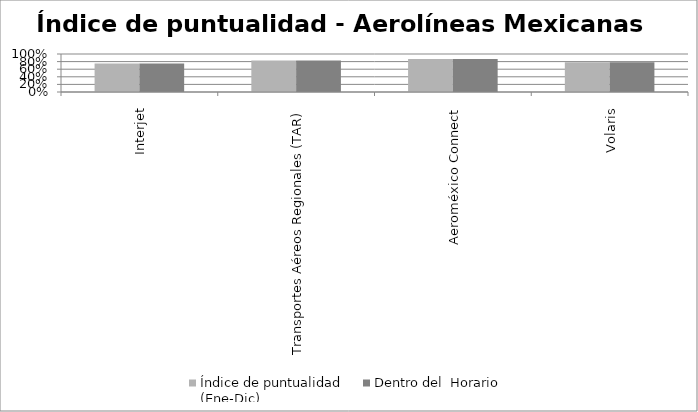
| Category | Índice de puntualidad
(Ene-Dic) | Dentro del  Horario |
|---|---|---|
| Interjet | 0.753 | 0.753 |
| Transportes Aéreos Regionales (TAR) | 0.827 | 0.827 |
| Aeroméxico Connect | 0.867 | 0.867 |
| Volaris | 0.784 | 0.784 |